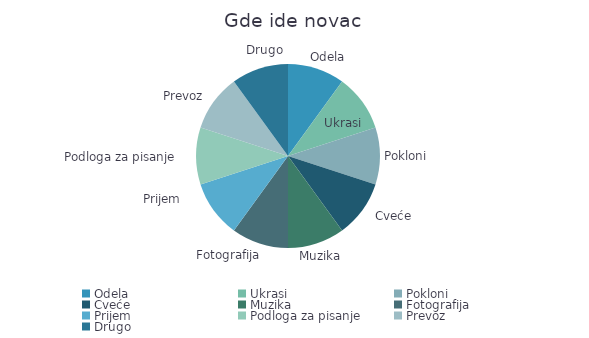
| Category | Iznos |
|---|---|
| Odela | 1 |
| Ukrasi | 1 |
| Pokloni | 1 |
| Cveće | 1 |
| Muzika | 1 |
| Fotografija | 1 |
| Prijem | 1 |
| Podloga za pisanje | 1 |
| Prevoz | 1 |
| Drugo | 1 |